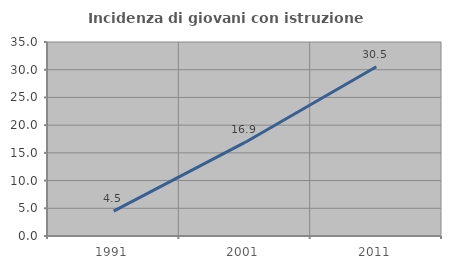
| Category | Incidenza di giovani con istruzione universitaria |
|---|---|
| 1991.0 | 4.5 |
| 2001.0 | 16.878 |
| 2011.0 | 30.538 |